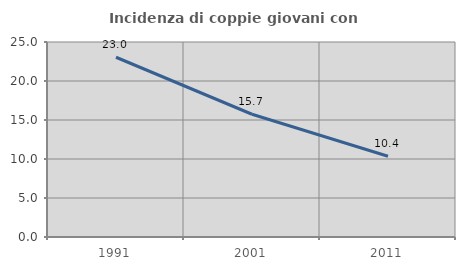
| Category | Incidenza di coppie giovani con figli |
|---|---|
| 1991.0 | 23.045 |
| 2001.0 | 15.737 |
| 2011.0 | 10.352 |